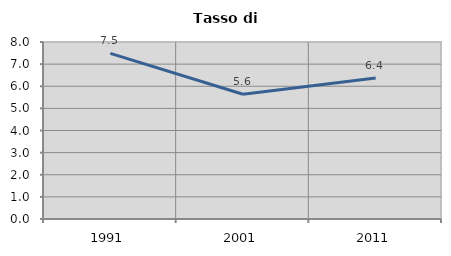
| Category | Tasso di disoccupazione   |
|---|---|
| 1991.0 | 7.487 |
| 2001.0 | 5.64 |
| 2011.0 | 6.37 |